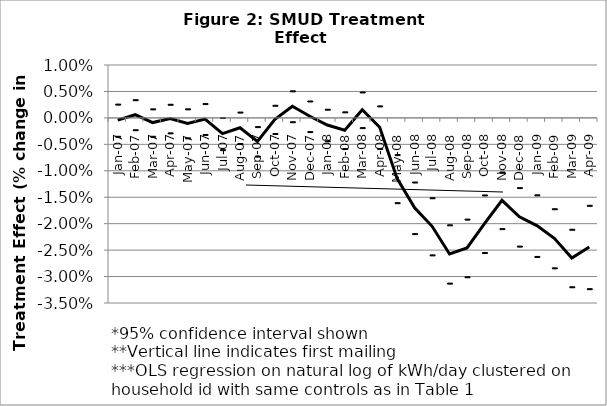
| Category | Series 0 | 2 SD below | 2 SD above |
|---|---|---|---|
| 2007-01-01 | 0 | -0.003 | 0.003 |
| 2007-02-01 | 0.001 | -0.002 | 0.003 |
| 2007-03-01 | -0.001 | -0.003 | 0.002 |
| 2007-04-01 | 0 | -0.003 | 0.003 |
| 2007-05-01 | -0.001 | -0.004 | 0.002 |
| 2007-06-01 | 0 | -0.003 | 0.003 |
| 2007-07-01 | -0.003 | -0.006 | 0 |
| 2007-08-01 | -0.002 | -0.005 | 0.001 |
| 2007-09-01 | -0.004 | -0.007 | -0.002 |
| 2007-10-01 | 0 | -0.003 | 0.002 |
| 2007-11-01 | 0.002 | -0.001 | 0.005 |
| 2007-12-01 | 0 | -0.003 | 0.003 |
| 2008-01-01 | -0.001 | -0.004 | 0.002 |
| 2008-02-01 | -0.002 | -0.006 | 0.001 |
| 2008-03-01 | 0.002 | -0.002 | 0.005 |
| 2008-04-01 | -0.002 | -0.006 | 0.002 |
| 2008-05-01 | -0.011 | -0.016 | -0.007 |
| 2008-06-01 | -0.017 | -0.022 | -0.012 |
| 2008-07-01 | -0.02 | -0.026 | -0.015 |
| 2008-08-01 | -0.026 | -0.031 | -0.02 |
| 2008-09-01 | -0.025 | -0.03 | -0.019 |
| 2008-10-01 | -0.02 | -0.025 | -0.015 |
| 2008-11-01 | -0.016 | -0.021 | -0.01 |
| 2008-12-01 | -0.019 | -0.024 | -0.013 |
| 2009-01-01 | -0.02 | -0.026 | -0.015 |
| 2009-02-01 | -0.023 | -0.028 | -0.017 |
| 2009-03-01 | -0.026 | -0.032 | -0.021 |
| 2009-04-01 | -0.024 | -0.032 | -0.017 |